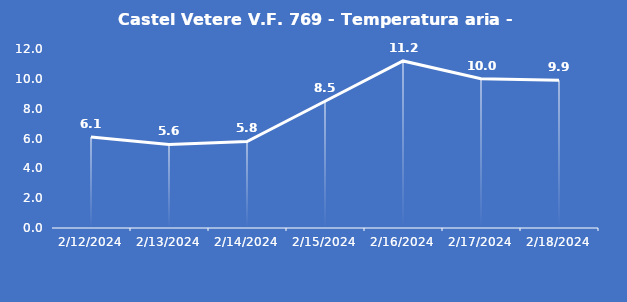
| Category | Castel Vetere V.F. 769 - Temperatura aria - Grezzo (°C) |
|---|---|
| 2/12/24 | 6.1 |
| 2/13/24 | 5.6 |
| 2/14/24 | 5.8 |
| 2/15/24 | 8.5 |
| 2/16/24 | 11.2 |
| 2/17/24 | 10 |
| 2/18/24 | 9.9 |